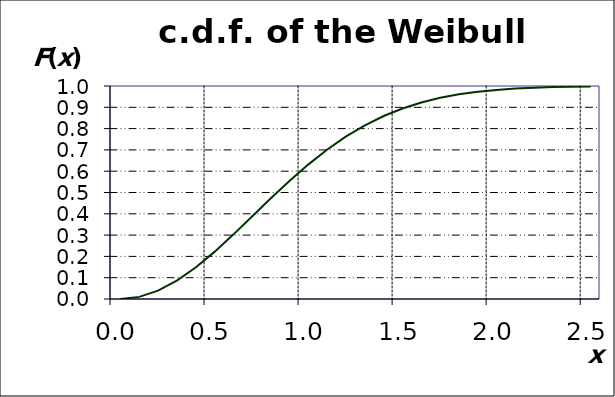
| Category | F(x) |
|---|---|
| 0.0 | 0 |
| 0.1 | 0.01 |
| 0.2 | 0.039 |
| 0.30000000000000004 | 0.086 |
| 0.4 | 0.148 |
| 0.5 | 0.221 |
| 0.6 | 0.302 |
| 0.7 | 0.387 |
| 0.7999999999999999 | 0.473 |
| 0.8999999999999999 | 0.555 |
| 0.9999999999999999 | 0.632 |
| 1.0999999999999999 | 0.702 |
| 1.2 | 0.763 |
| 1.3 | 0.815 |
| 1.4000000000000001 | 0.859 |
| 1.5000000000000002 | 0.895 |
| 1.6000000000000003 | 0.923 |
| 1.7000000000000004 | 0.944 |
| 1.8000000000000005 | 0.961 |
| 1.9000000000000006 | 0.973 |
| 2.0000000000000004 | 0.982 |
| 2.1000000000000005 | 0.988 |
| 2.2000000000000006 | 0.992 |
| 2.3000000000000007 | 0.995 |
| 2.400000000000001 | 0.997 |
| 2.500000000000001 | 0.998 |